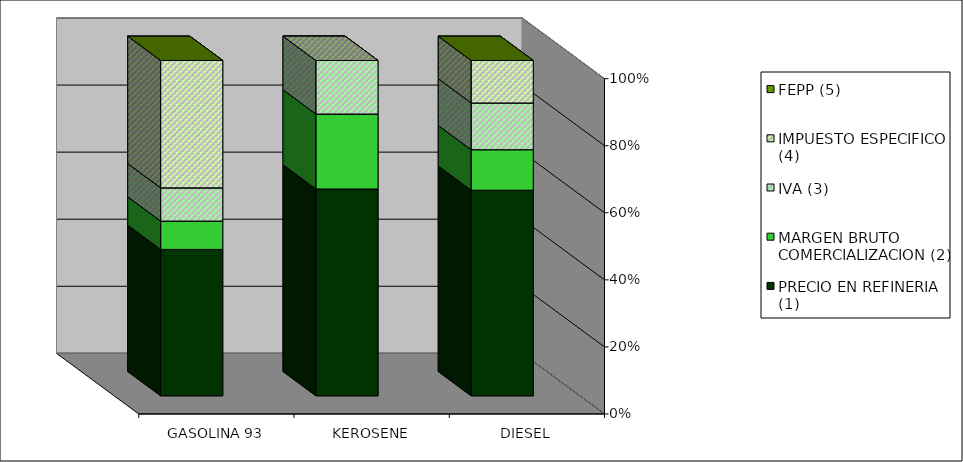
| Category | PRECIO EN REFINERIA (1) | MARGEN BRUTO COMERCIALIZACION (2) | IVA (3) | IMPUESTO ESPECIFICO (4) | FEPP (5) |
|---|---|---|---|---|---|
| GASOLINA 93 | 0.437 | 0.085 | 0.099 | 0.38 | 0 |
| KEROSENE | 0.617 | 0.224 | 0.16 | 0 | 0 |
| DIESEL | 0.613 | 0.121 | 0.139 | 0.127 | 0 |